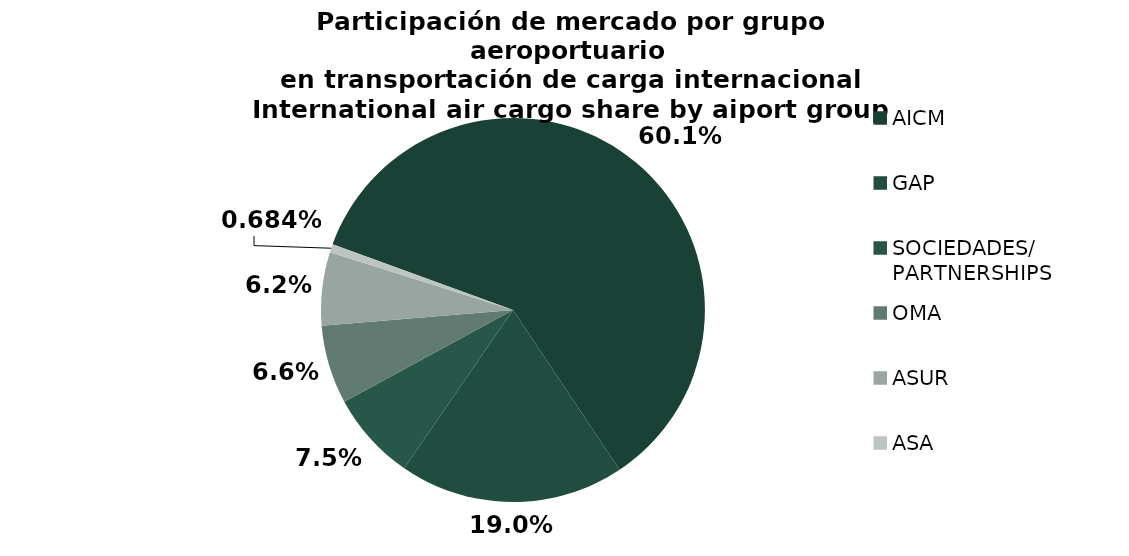
| Category | Series 0 |
|---|---|
| AICM | 40229.262 |
| GAP | 12694.489 |
| SOCIEDADES/
PARTNERSHIPS | 5017.502 |
| OMA | 4430.19 |
| ASUR | 4134.99 |
| ASA | 458.5 |